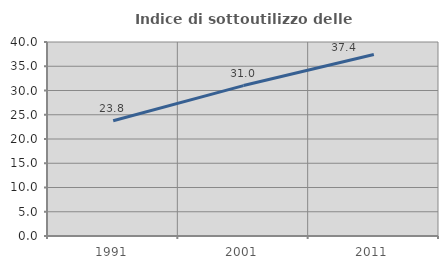
| Category | Indice di sottoutilizzo delle abitazioni  |
|---|---|
| 1991.0 | 23.766 |
| 2001.0 | 31.016 |
| 2011.0 | 37.41 |